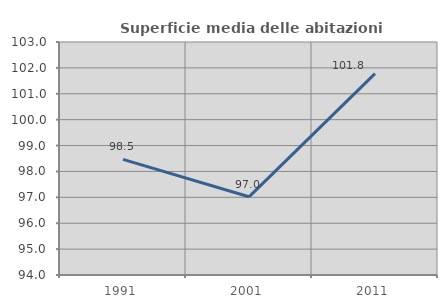
| Category | Superficie media delle abitazioni occupate |
|---|---|
| 1991.0 | 98.469 |
| 2001.0 | 97.02 |
| 2011.0 | 101.778 |